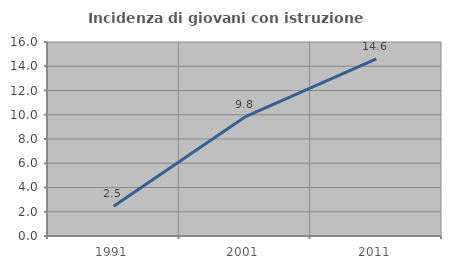
| Category | Incidenza di giovani con istruzione universitaria |
|---|---|
| 1991.0 | 2.459 |
| 2001.0 | 9.821 |
| 2011.0 | 14.607 |